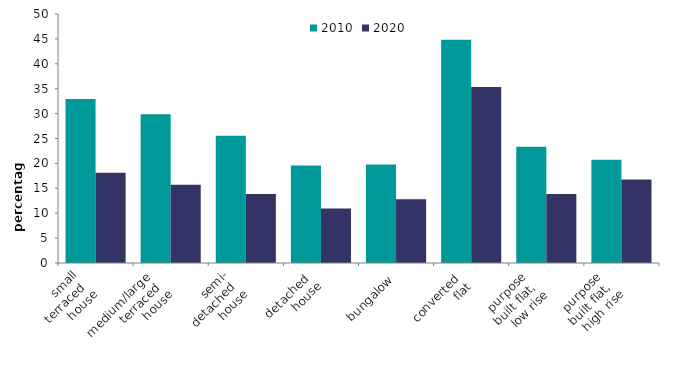
| Category | 2010 | 2020 |
|---|---|---|
| small
 terraced 
house | 32.953 | 18.136 |
| medium/large 
terraced 
house | 29.867 | 15.717 |
| semi-
detached 
house | 25.542 | 13.88 |
| detached 
house | 19.562 | 10.955 |
| bungalow | 19.798 | 12.806 |
| converted 
flat | 44.851 | 35.366 |
| purpose 
built flat, 
low rise | 23.331 | 13.873 |
| purpose 
built flat, 
high rise | 20.751 | 16.769 |